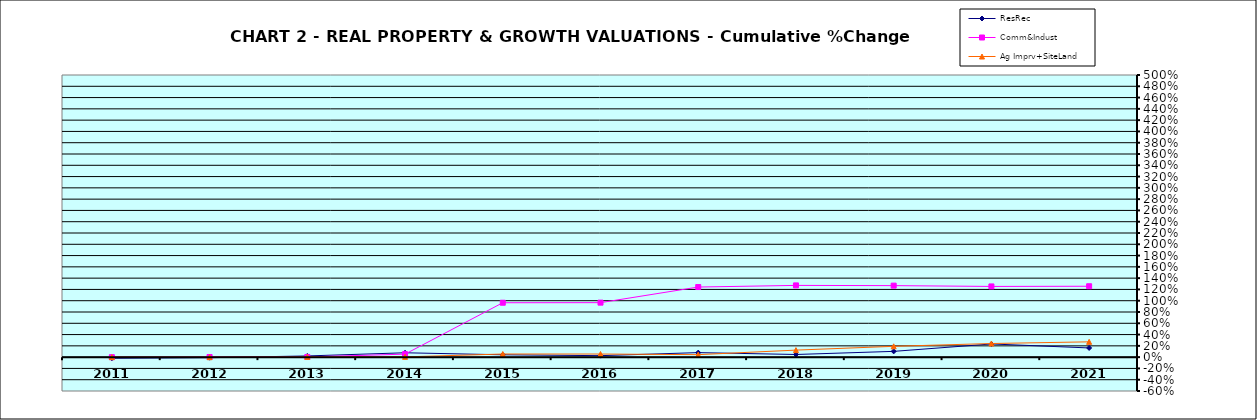
| Category | ResRec | Comm&Indust | Ag Imprv+SiteLand |
|---|---|---|---|
| 2011.0 | -0.02 | 0 | 0 |
| 2012.0 | -0.01 | 0.003 | -0.001 |
| 2013.0 | 0.021 | 0.004 | 0.004 |
| 2014.0 | 0.078 | 0.053 | 0.005 |
| 2015.0 | 0.042 | 0.964 | 0.055 |
| 2016.0 | 0.026 | 0.966 | 0.055 |
| 2017.0 | 0.08 | 1.242 | 0.044 |
| 2018.0 | 0.047 | 1.271 | 0.125 |
| 2019.0 | 0.102 | 1.267 | 0.192 |
| 2020.0 | 0.234 | 1.253 | 0.241 |
| 2021.0 | 0.163 | 1.256 | 0.271 |